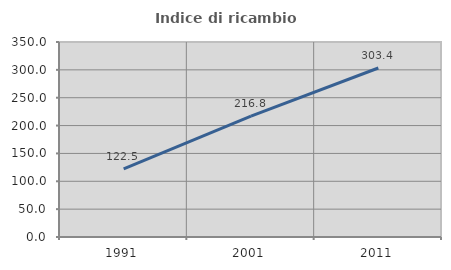
| Category | Indice di ricambio occupazionale  |
|---|---|
| 1991.0 | 122.464 |
| 2001.0 | 216.84 |
| 2011.0 | 303.382 |